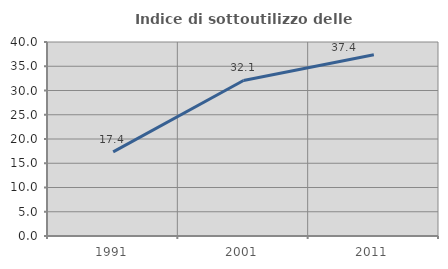
| Category | Indice di sottoutilizzo delle abitazioni  |
|---|---|
| 1991.0 | 17.35 |
| 2001.0 | 32.063 |
| 2011.0 | 37.375 |